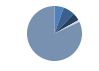
| Category | Series 0 |
|---|---|
| ARRASTRE | 18 |
| CERCO | 23 |
| PALANGRE | 15 |
| REDES DE ENMALLE | 3 |
| ARTES FIJAS | 1 |
| ARTES MENORES | 272 |